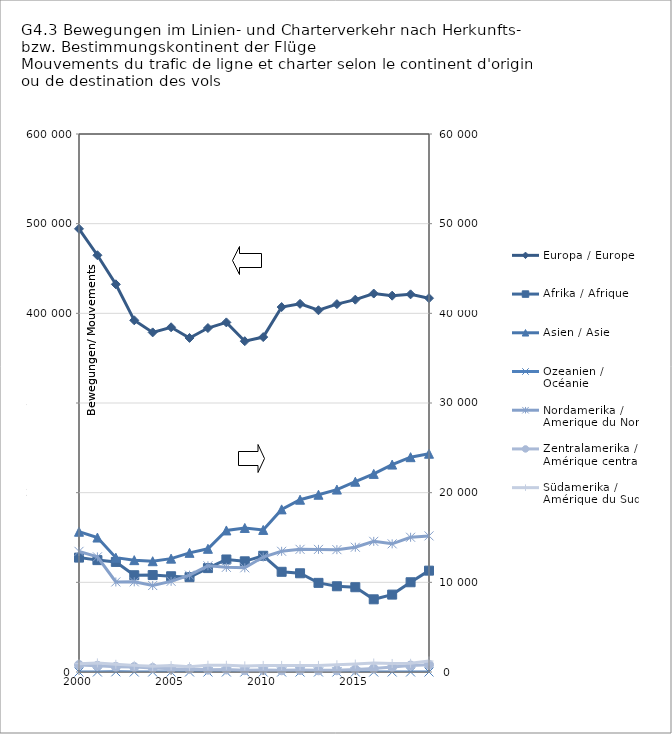
| Category | Europa / Europe |
|---|---|
| 2000.0 | 494247 |
| 2001.0 | 464792 |
| 2002.0 | 432368 |
| 2003.0 | 392219 |
| 2004.0 | 378737 |
| 2005.0 | 384453 |
| 2006.0 | 372550 |
| 2007.0 | 383593 |
| 2008.0 | 389901 |
| 2009.0 | 368933 |
| 2010.0 | 373520 |
| 2011.0 | 406994 |
| 2012.0 | 410573 |
| 2013.0 | 403430 |
| 2014.0 | 410285 |
| 2015.0 | 415226 |
| 2016.0 | 422070 |
| 2017.0 | 419704 |
| 2018.0 | 421183 |
| 2019.0 | 416907 |